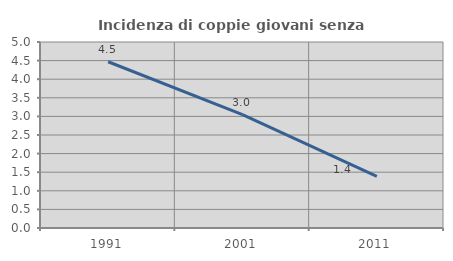
| Category | Incidenza di coppie giovani senza figli |
|---|---|
| 1991.0 | 4.469 |
| 2001.0 | 3.046 |
| 2011.0 | 1.388 |